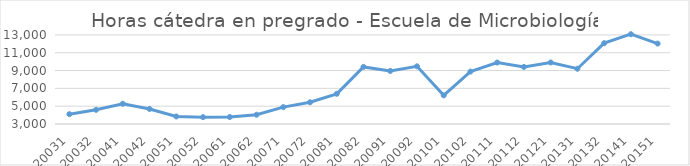
| Category | Total horas |
|---|---|
| 20031 | 4103 |
| 20032 | 4590 |
| 20041 | 5273 |
| 20042 | 4690 |
| 20051 | 3844 |
| 20052 | 3769 |
| 20061 | 3784 |
| 20062 | 4040 |
| 20071 | 4896 |
| 20072 | 5437 |
| 20081 | 6389 |
| 20082 | 9409 |
| 20091 | 8956 |
| 20092 | 9476 |
| 20101 | 6213 |
| 20102 | 8884 |
| 20111 | 9899 |
| 20112 | 9402 |
| 20121 | 9906 |
| 20131 | 9204 |
| 20132 | 12072 |
| 20141 | 13080 |
| 20151 | 12026 |